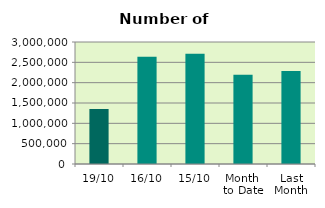
| Category | Series 0 |
|---|---|
| 19/10 | 1353372 |
| 16/10 | 2634606 |
| 15/10 | 2709806 |
| Month 
to Date | 2193920.308 |
| Last
Month | 2288803 |